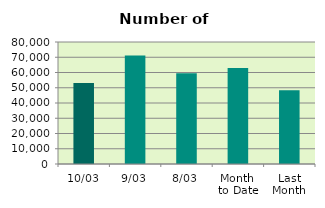
| Category | Series 0 |
|---|---|
| 10/03 | 53116 |
| 9/03 | 71182 |
| 8/03 | 59526 |
| Month 
to Date | 62908 |
| Last
Month | 48363.3 |